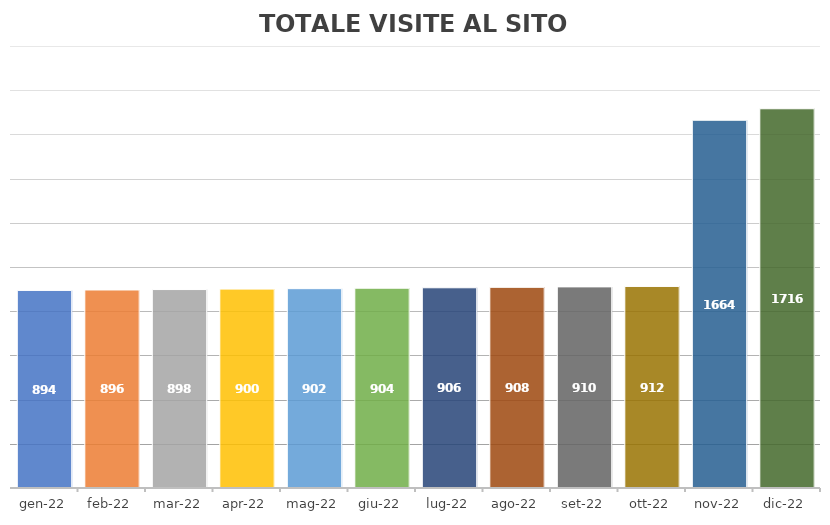
| Category | TOTALE |
|---|---|
| 2022-01-18 | 894 |
| 2022-02-18 | 896 |
| 2022-03-18 | 898 |
| 2022-04-18 | 900 |
| 2022-05-18 | 902 |
| 2022-06-18 | 904 |
| 2022-07-18 | 906 |
| 2022-08-18 | 908 |
| 2022-09-18 | 910 |
| 2022-10-18 | 912 |
| 2022-11-18 | 1664 |
| 2022-12-18 | 1716 |